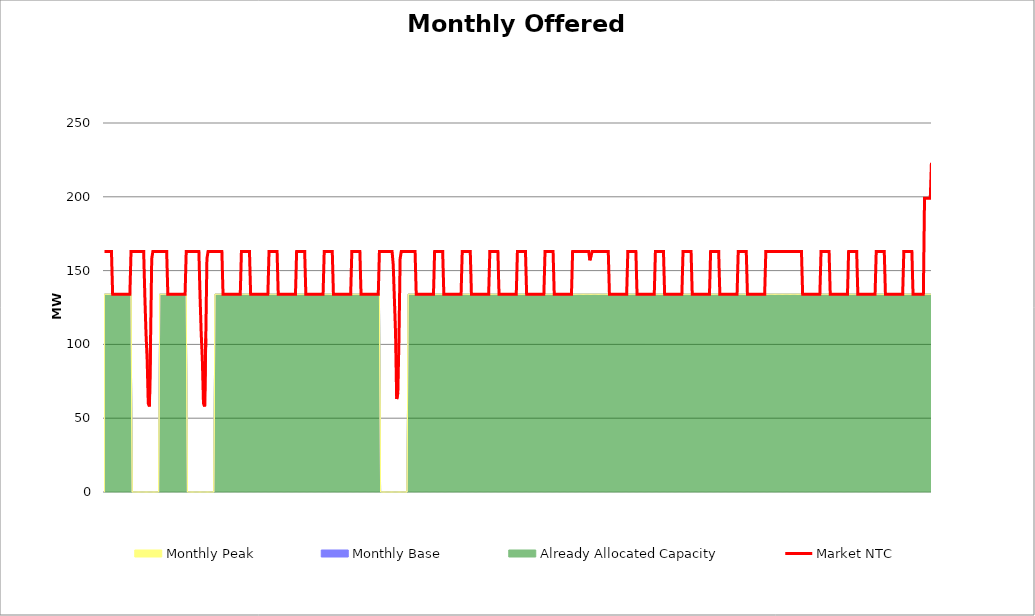
| Category | Market NTC |
|---|---|
| 0 | 163 |
| 1 | 163 |
| 2 | 163 |
| 3 | 163 |
| 4 | 163 |
| 5 | 163 |
| 6 | 163 |
| 7 | 134 |
| 8 | 134 |
| 9 | 134 |
| 10 | 134 |
| 11 | 134 |
| 12 | 134 |
| 13 | 134 |
| 14 | 134 |
| 15 | 134 |
| 16 | 134 |
| 17 | 134 |
| 18 | 134 |
| 19 | 134 |
| 20 | 134 |
| 21 | 134 |
| 22 | 134 |
| 23 | 163 |
| 24 | 163 |
| 25 | 163 |
| 26 | 163 |
| 27 | 163 |
| 28 | 163 |
| 29 | 163 |
| 30 | 163 |
| 31 | 163 |
| 32 | 163 |
| 33 | 163 |
| 34 | 163 |
| 35 | 133 |
| 36 | 108 |
| 37 | 90 |
| 38 | 60 |
| 39 | 58 |
| 40 | 104 |
| 41 | 158 |
| 42 | 163 |
| 43 | 163 |
| 44 | 163 |
| 45 | 163 |
| 46 | 163 |
| 47 | 163 |
| 48 | 163 |
| 49 | 163 |
| 50 | 163 |
| 51 | 163 |
| 52 | 163 |
| 53 | 163 |
| 54 | 163 |
| 55 | 134 |
| 56 | 134 |
| 57 | 134 |
| 58 | 134 |
| 59 | 134 |
| 60 | 134 |
| 61 | 134 |
| 62 | 134 |
| 63 | 134 |
| 64 | 134 |
| 65 | 134 |
| 66 | 134 |
| 67 | 134 |
| 68 | 134 |
| 69 | 134 |
| 70 | 134 |
| 71 | 163 |
| 72 | 163 |
| 73 | 163 |
| 74 | 163 |
| 75 | 163 |
| 76 | 163 |
| 77 | 163 |
| 78 | 163 |
| 79 | 163 |
| 80 | 163 |
| 81 | 163 |
| 82 | 163 |
| 83 | 133 |
| 84 | 108 |
| 85 | 90 |
| 86 | 60 |
| 87 | 58 |
| 88 | 104 |
| 89 | 158 |
| 90 | 163 |
| 91 | 163 |
| 92 | 163 |
| 93 | 163 |
| 94 | 163 |
| 95 | 163 |
| 96 | 163 |
| 97 | 163 |
| 98 | 163 |
| 99 | 163 |
| 100 | 163 |
| 101 | 163 |
| 102 | 163 |
| 103 | 134 |
| 104 | 134 |
| 105 | 134 |
| 106 | 134 |
| 107 | 134 |
| 108 | 134 |
| 109 | 134 |
| 110 | 134 |
| 111 | 134 |
| 112 | 134 |
| 113 | 134 |
| 114 | 134 |
| 115 | 134 |
| 116 | 134 |
| 117 | 134 |
| 118 | 134 |
| 119 | 163 |
| 120 | 163 |
| 121 | 163 |
| 122 | 163 |
| 123 | 163 |
| 124 | 163 |
| 125 | 163 |
| 126 | 163 |
| 127 | 134 |
| 128 | 134 |
| 129 | 134 |
| 130 | 134 |
| 131 | 134 |
| 132 | 134 |
| 133 | 134 |
| 134 | 134 |
| 135 | 134 |
| 136 | 134 |
| 137 | 134 |
| 138 | 134 |
| 139 | 134 |
| 140 | 134 |
| 141 | 134 |
| 142 | 134 |
| 143 | 163 |
| 144 | 163 |
| 145 | 163 |
| 146 | 163 |
| 147 | 163 |
| 148 | 163 |
| 149 | 163 |
| 150 | 163 |
| 151 | 134 |
| 152 | 134 |
| 153 | 134 |
| 154 | 134 |
| 155 | 134 |
| 156 | 134 |
| 157 | 134 |
| 158 | 134 |
| 159 | 134 |
| 160 | 134 |
| 161 | 134 |
| 162 | 134 |
| 163 | 134 |
| 164 | 134 |
| 165 | 134 |
| 166 | 134 |
| 167 | 163 |
| 168 | 163 |
| 169 | 163 |
| 170 | 163 |
| 171 | 163 |
| 172 | 163 |
| 173 | 163 |
| 174 | 163 |
| 175 | 134 |
| 176 | 134 |
| 177 | 134 |
| 178 | 134 |
| 179 | 134 |
| 180 | 134 |
| 181 | 134 |
| 182 | 134 |
| 183 | 134 |
| 184 | 134 |
| 185 | 134 |
| 186 | 134 |
| 187 | 134 |
| 188 | 134 |
| 189 | 134 |
| 190 | 134 |
| 191 | 163 |
| 192 | 163 |
| 193 | 163 |
| 194 | 163 |
| 195 | 163 |
| 196 | 163 |
| 197 | 163 |
| 198 | 163 |
| 199 | 134 |
| 200 | 134 |
| 201 | 134 |
| 202 | 134 |
| 203 | 134 |
| 204 | 134 |
| 205 | 134 |
| 206 | 134 |
| 207 | 134 |
| 208 | 134 |
| 209 | 134 |
| 210 | 134 |
| 211 | 134 |
| 212 | 134 |
| 213 | 134 |
| 214 | 134 |
| 215 | 163 |
| 216 | 163 |
| 217 | 163 |
| 218 | 163 |
| 219 | 163 |
| 220 | 163 |
| 221 | 163 |
| 222 | 163 |
| 223 | 134 |
| 224 | 134 |
| 225 | 134 |
| 226 | 134 |
| 227 | 134 |
| 228 | 134 |
| 229 | 134 |
| 230 | 134 |
| 231 | 134 |
| 232 | 134 |
| 233 | 134 |
| 234 | 134 |
| 235 | 134 |
| 236 | 134 |
| 237 | 134 |
| 238 | 134 |
| 239 | 163 |
| 240 | 163 |
| 241 | 163 |
| 242 | 163 |
| 243 | 163 |
| 244 | 163 |
| 245 | 163 |
| 246 | 163 |
| 247 | 163 |
| 248 | 163 |
| 249 | 163 |
| 250 | 163 |
| 251 | 154 |
| 252 | 131 |
| 253 | 108 |
| 254 | 63 |
| 255 | 67 |
| 256 | 104 |
| 257 | 158 |
| 258 | 163 |
| 259 | 163 |
| 260 | 163 |
| 261 | 163 |
| 262 | 163 |
| 263 | 163 |
| 264 | 163 |
| 265 | 163 |
| 266 | 163 |
| 267 | 163 |
| 268 | 163 |
| 269 | 163 |
| 270 | 163 |
| 271 | 134 |
| 272 | 134 |
| 273 | 134 |
| 274 | 134 |
| 275 | 134 |
| 276 | 134 |
| 277 | 134 |
| 278 | 134 |
| 279 | 134 |
| 280 | 134 |
| 281 | 134 |
| 282 | 134 |
| 283 | 134 |
| 284 | 134 |
| 285 | 134 |
| 286 | 134 |
| 287 | 163 |
| 288 | 163 |
| 289 | 163 |
| 290 | 163 |
| 291 | 163 |
| 292 | 163 |
| 293 | 163 |
| 294 | 163 |
| 295 | 134 |
| 296 | 134 |
| 297 | 134 |
| 298 | 134 |
| 299 | 134 |
| 300 | 134 |
| 301 | 134 |
| 302 | 134 |
| 303 | 134 |
| 304 | 134 |
| 305 | 134 |
| 306 | 134 |
| 307 | 134 |
| 308 | 134 |
| 309 | 134 |
| 310 | 134 |
| 311 | 163 |
| 312 | 163 |
| 313 | 163 |
| 314 | 163 |
| 315 | 163 |
| 316 | 163 |
| 317 | 163 |
| 318 | 163 |
| 319 | 134 |
| 320 | 134 |
| 321 | 134 |
| 322 | 134 |
| 323 | 134 |
| 324 | 134 |
| 325 | 134 |
| 326 | 134 |
| 327 | 134 |
| 328 | 134 |
| 329 | 134 |
| 330 | 134 |
| 331 | 134 |
| 332 | 134 |
| 333 | 134 |
| 334 | 134 |
| 335 | 163 |
| 336 | 163 |
| 337 | 163 |
| 338 | 163 |
| 339 | 163 |
| 340 | 163 |
| 341 | 163 |
| 342 | 163 |
| 343 | 134 |
| 344 | 134 |
| 345 | 134 |
| 346 | 134 |
| 347 | 134 |
| 348 | 134 |
| 349 | 134 |
| 350 | 134 |
| 351 | 134 |
| 352 | 134 |
| 353 | 134 |
| 354 | 134 |
| 355 | 134 |
| 356 | 134 |
| 357 | 134 |
| 358 | 134 |
| 359 | 163 |
| 360 | 163 |
| 361 | 163 |
| 362 | 163 |
| 363 | 163 |
| 364 | 163 |
| 365 | 163 |
| 366 | 163 |
| 367 | 134 |
| 368 | 134 |
| 369 | 134 |
| 370 | 134 |
| 371 | 134 |
| 372 | 134 |
| 373 | 134 |
| 374 | 134 |
| 375 | 134 |
| 376 | 134 |
| 377 | 134 |
| 378 | 134 |
| 379 | 134 |
| 380 | 134 |
| 381 | 134 |
| 382 | 134 |
| 383 | 163 |
| 384 | 163 |
| 385 | 163 |
| 386 | 163 |
| 387 | 163 |
| 388 | 163 |
| 389 | 163 |
| 390 | 163 |
| 391 | 134 |
| 392 | 134 |
| 393 | 134 |
| 394 | 134 |
| 395 | 134 |
| 396 | 134 |
| 397 | 134 |
| 398 | 134 |
| 399 | 134 |
| 400 | 134 |
| 401 | 134 |
| 402 | 134 |
| 403 | 134 |
| 404 | 134 |
| 405 | 134 |
| 406 | 134 |
| 407 | 163 |
| 408 | 163 |
| 409 | 163 |
| 410 | 163 |
| 411 | 163 |
| 412 | 163 |
| 413 | 163 |
| 414 | 163 |
| 415 | 163 |
| 416 | 163 |
| 417 | 163 |
| 418 | 163 |
| 419 | 163 |
| 420 | 163 |
| 421 | 163 |
| 422 | 157 |
| 423 | 160 |
| 424 | 163 |
| 425 | 163 |
| 426 | 163 |
| 427 | 163 |
| 428 | 163 |
| 429 | 163 |
| 430 | 163 |
| 431 | 163 |
| 432 | 163 |
| 433 | 163 |
| 434 | 163 |
| 435 | 163 |
| 436 | 163 |
| 437 | 163 |
| 438 | 163 |
| 439 | 134 |
| 440 | 134 |
| 441 | 134 |
| 442 | 134 |
| 443 | 134 |
| 444 | 134 |
| 445 | 134 |
| 446 | 134 |
| 447 | 134 |
| 448 | 134 |
| 449 | 134 |
| 450 | 134 |
| 451 | 134 |
| 452 | 134 |
| 453 | 134 |
| 454 | 134 |
| 455 | 163 |
| 456 | 163 |
| 457 | 163 |
| 458 | 163 |
| 459 | 163 |
| 460 | 163 |
| 461 | 163 |
| 462 | 163 |
| 463 | 134 |
| 464 | 134 |
| 465 | 134 |
| 466 | 134 |
| 467 | 134 |
| 468 | 134 |
| 469 | 134 |
| 470 | 134 |
| 471 | 134 |
| 472 | 134 |
| 473 | 134 |
| 474 | 134 |
| 475 | 134 |
| 476 | 134 |
| 477 | 134 |
| 478 | 134 |
| 479 | 163 |
| 480 | 163 |
| 481 | 163 |
| 482 | 163 |
| 483 | 163 |
| 484 | 163 |
| 485 | 163 |
| 486 | 163 |
| 487 | 134 |
| 488 | 134 |
| 489 | 134 |
| 490 | 134 |
| 491 | 134 |
| 492 | 134 |
| 493 | 134 |
| 494 | 134 |
| 495 | 134 |
| 496 | 134 |
| 497 | 134 |
| 498 | 134 |
| 499 | 134 |
| 500 | 134 |
| 501 | 134 |
| 502 | 134 |
| 503 | 163 |
| 504 | 163 |
| 505 | 163 |
| 506 | 163 |
| 507 | 163 |
| 508 | 163 |
| 509 | 163 |
| 510 | 163 |
| 511 | 134 |
| 512 | 134 |
| 513 | 134 |
| 514 | 134 |
| 515 | 134 |
| 516 | 134 |
| 517 | 134 |
| 518 | 134 |
| 519 | 134 |
| 520 | 134 |
| 521 | 134 |
| 522 | 134 |
| 523 | 134 |
| 524 | 134 |
| 525 | 134 |
| 526 | 134 |
| 527 | 163 |
| 528 | 163 |
| 529 | 163 |
| 530 | 163 |
| 531 | 163 |
| 532 | 163 |
| 533 | 163 |
| 534 | 163 |
| 535 | 134 |
| 536 | 134 |
| 537 | 134 |
| 538 | 134 |
| 539 | 134 |
| 540 | 134 |
| 541 | 134 |
| 542 | 134 |
| 543 | 134 |
| 544 | 134 |
| 545 | 134 |
| 546 | 134 |
| 547 | 134 |
| 548 | 134 |
| 549 | 134 |
| 550 | 134 |
| 551 | 163 |
| 552 | 163 |
| 553 | 163 |
| 554 | 163 |
| 555 | 163 |
| 556 | 163 |
| 557 | 163 |
| 558 | 163 |
| 559 | 134 |
| 560 | 134 |
| 561 | 134 |
| 562 | 134 |
| 563 | 134 |
| 564 | 134 |
| 565 | 134 |
| 566 | 134 |
| 567 | 134 |
| 568 | 134 |
| 569 | 134 |
| 570 | 134 |
| 571 | 134 |
| 572 | 134 |
| 573 | 134 |
| 574 | 134 |
| 575 | 163 |
| 576 | 163 |
| 577 | 163 |
| 578 | 163 |
| 579 | 163 |
| 580 | 163 |
| 581 | 163 |
| 582 | 163 |
| 583 | 163 |
| 584 | 163 |
| 585 | 163 |
| 586 | 163 |
| 587 | 163 |
| 588 | 163 |
| 589 | 163 |
| 590 | 163 |
| 591 | 163 |
| 592 | 163 |
| 593 | 163 |
| 594 | 163 |
| 595 | 163 |
| 596 | 163 |
| 597 | 163 |
| 598 | 163 |
| 599 | 163 |
| 600 | 163 |
| 601 | 163 |
| 602 | 163 |
| 603 | 163 |
| 604 | 163 |
| 605 | 163 |
| 606 | 163 |
| 607 | 134 |
| 608 | 134 |
| 609 | 134 |
| 610 | 134 |
| 611 | 134 |
| 612 | 134 |
| 613 | 134 |
| 614 | 134 |
| 615 | 134 |
| 616 | 134 |
| 617 | 134 |
| 618 | 134 |
| 619 | 134 |
| 620 | 134 |
| 621 | 134 |
| 622 | 134 |
| 623 | 163 |
| 624 | 163 |
| 625 | 163 |
| 626 | 163 |
| 627 | 163 |
| 628 | 163 |
| 629 | 163 |
| 630 | 163 |
| 631 | 134 |
| 632 | 134 |
| 633 | 134 |
| 634 | 134 |
| 635 | 134 |
| 636 | 134 |
| 637 | 134 |
| 638 | 134 |
| 639 | 134 |
| 640 | 134 |
| 641 | 134 |
| 642 | 134 |
| 643 | 134 |
| 644 | 134 |
| 645 | 134 |
| 646 | 134 |
| 647 | 163 |
| 648 | 163 |
| 649 | 163 |
| 650 | 163 |
| 651 | 163 |
| 652 | 163 |
| 653 | 163 |
| 654 | 163 |
| 655 | 134 |
| 656 | 134 |
| 657 | 134 |
| 658 | 134 |
| 659 | 134 |
| 660 | 134 |
| 661 | 134 |
| 662 | 134 |
| 663 | 134 |
| 664 | 134 |
| 665 | 134 |
| 666 | 134 |
| 667 | 134 |
| 668 | 134 |
| 669 | 134 |
| 670 | 134 |
| 671 | 163 |
| 672 | 163 |
| 673 | 163 |
| 674 | 163 |
| 675 | 163 |
| 676 | 163 |
| 677 | 163 |
| 678 | 163 |
| 679 | 134 |
| 680 | 134 |
| 681 | 134 |
| 682 | 134 |
| 683 | 134 |
| 684 | 134 |
| 685 | 134 |
| 686 | 134 |
| 687 | 134 |
| 688 | 134 |
| 689 | 134 |
| 690 | 134 |
| 691 | 134 |
| 692 | 134 |
| 693 | 134 |
| 694 | 134 |
| 695 | 163 |
| 696 | 163 |
| 697 | 163 |
| 698 | 163 |
| 699 | 163 |
| 700 | 163 |
| 701 | 163 |
| 702 | 163 |
| 703 | 134 |
| 704 | 134 |
| 705 | 134 |
| 706 | 134 |
| 707 | 134 |
| 708 | 134 |
| 709 | 134 |
| 710 | 134 |
| 711 | 134 |
| 712 | 134 |
| 713 | 199 |
| 714 | 199 |
| 715 | 199 |
| 716 | 199 |
| 717 | 199 |
| 718 | 199 |
| 719 | 223 |